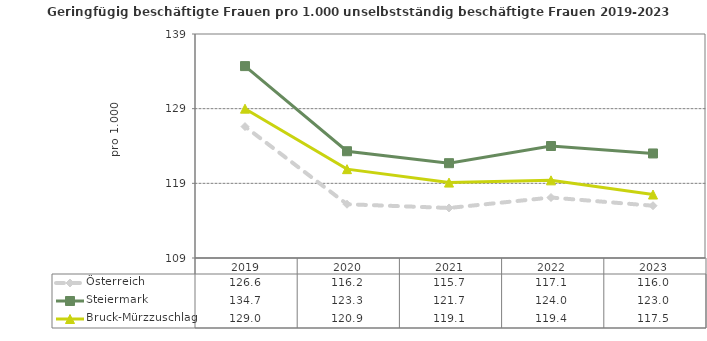
| Category | Österreich | Steiermark | Bruck-Mürzzuschlag |
|---|---|---|---|
| 2023.0 | 116 | 123 | 117.5 |
| 2022.0 | 117.1 | 124 | 119.4 |
| 2021.0 | 115.7 | 121.7 | 119.1 |
| 2020.0 | 116.2 | 123.3 | 120.9 |
| 2019.0 | 126.6 | 134.7 | 129 |